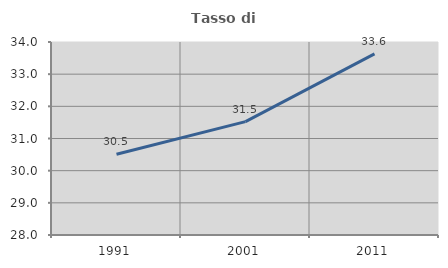
| Category | Tasso di occupazione   |
|---|---|
| 1991.0 | 30.512 |
| 2001.0 | 31.524 |
| 2011.0 | 33.629 |